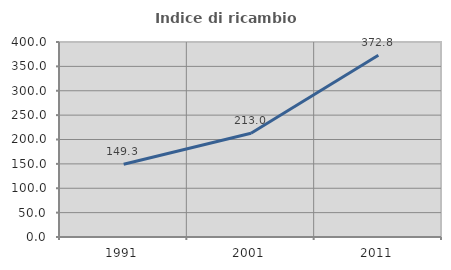
| Category | Indice di ricambio occupazionale  |
|---|---|
| 1991.0 | 149.277 |
| 2001.0 | 212.981 |
| 2011.0 | 372.809 |